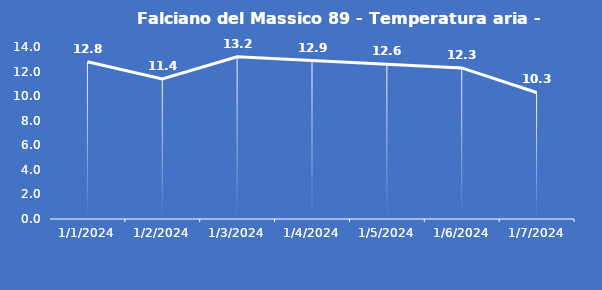
| Category | Falciano del Massico 89 - Temperatura aria - Grezzo (°C) |
|---|---|
| 1/1/24 | 12.8 |
| 1/2/24 | 11.4 |
| 1/3/24 | 13.2 |
| 1/4/24 | 12.9 |
| 1/5/24 | 12.6 |
| 1/6/24 | 12.3 |
| 1/7/24 | 10.3 |